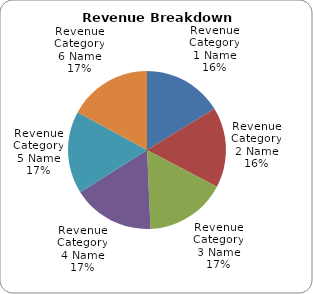
| Category | Series 0 |
|---|---|
| Revenue Category 1 Name | 103 |
| Revenue Category 2 Name | 104 |
| Revenue Category 3 Name | 105 |
| Revenue Category 4 Name | 106 |
| Revenue Category 5 Name | 107 |
| Revenue Category 6 Name | 108 |